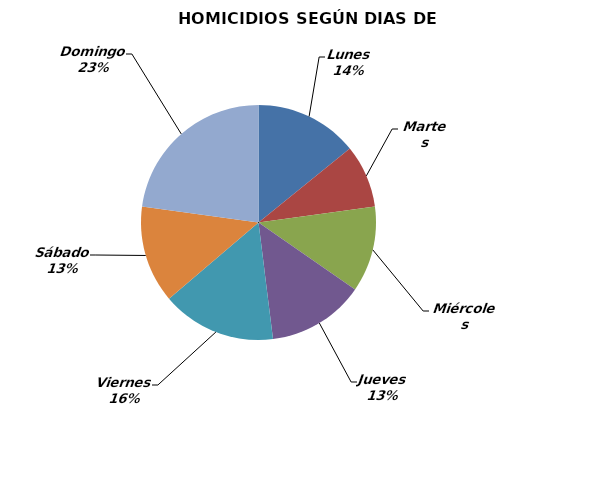
| Category | Series 0 |
|---|---|
| Lunes | 18 |
| Martes | 11 |
| Miércoles | 15 |
| Jueves | 17 |
| Viernes | 20 |
| Sábado | 17 |
| Domingo | 29 |